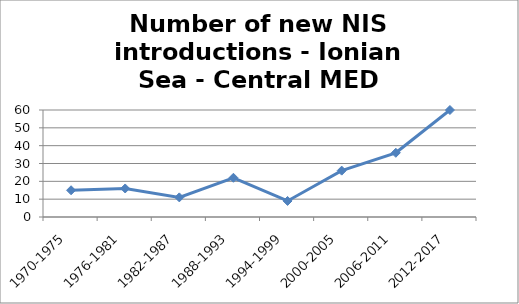
| Category | Number of new NIS introductions - Ionian Sea - Central MED |
|---|---|
| 1970-1975 | 15 |
| 1976-1981 | 16 |
| 1982-1987 | 11 |
| 1988-1993 | 22 |
| 1994-1999 | 9 |
| 2000-2005 | 26 |
| 2006-2011 | 36 |
| 2012-2017 | 60 |